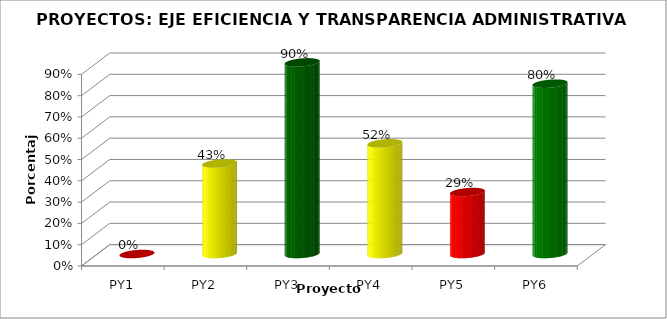
| Category | Series 0 |
|---|---|
| PY1 | 0 |
| PY2 | 0.425 |
| PY3 | 0.9 |
| PY4 | 0.52 |
| PY5 | 0.291 |
| PY6 | 0.8 |